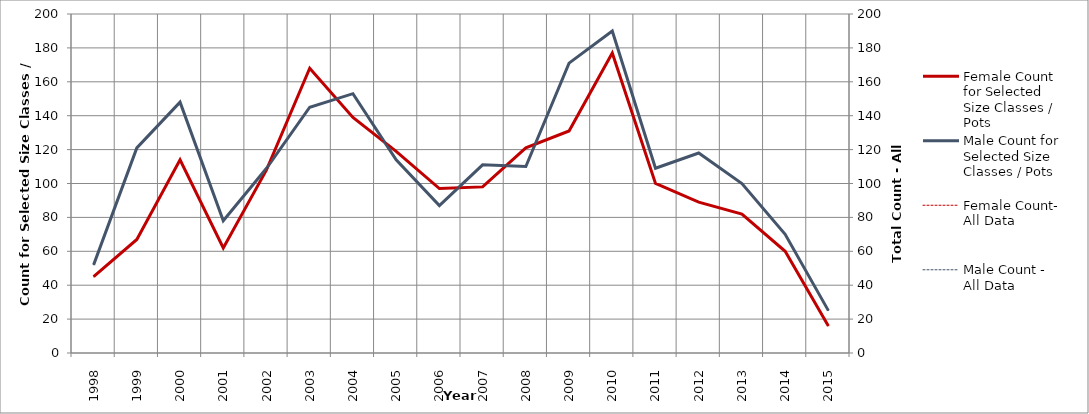
| Category | Female Count for Selected Size Classes / Pots | Male Count for Selected Size Classes / Pots |
|---|---|---|
| 1998.0 | 45 | 52 |
| 1999.0 | 67 | 121 |
| 2000.0 | 114 | 148 |
| 2001.0 | 62 | 78 |
| 2002.0 | 108 | 109 |
| 2003.0 | 168 | 145 |
| 2004.0 | 139 | 153 |
| 2005.0 | 119 | 114 |
| 2006.0 | 97 | 87 |
| 2007.0 | 98 | 111 |
| 2008.0 | 121 | 110 |
| 2009.0 | 131 | 171 |
| 2010.0 | 177 | 190 |
| 2011.0 | 100 | 109 |
| 2012.0 | 89 | 118 |
| 2013.0 | 82 | 100 |
| 2014.0 | 60 | 70 |
| 2015.0 | 16 | 25 |